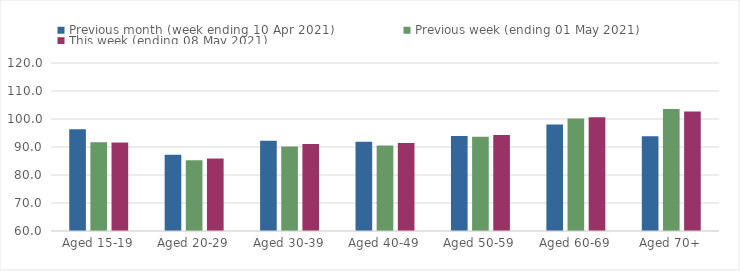
| Category | Previous month (week ending 10 Apr 2021) | Previous week (ending 01 May 2021) | This week (ending 08 May 2021) |
|---|---|---|---|
| Aged 15-19 | 96.32 | 91.7 | 91.64 |
| Aged 20-29 | 87.26 | 85.27 | 85.9 |
| Aged 30-39 | 92.22 | 90.17 | 91.11 |
| Aged 40-49 | 91.85 | 90.54 | 91.45 |
| Aged 50-59 | 93.92 | 93.64 | 94.29 |
| Aged 60-69 | 98.06 | 100.21 | 100.65 |
| Aged 70+ | 93.88 | 103.53 | 102.68 |